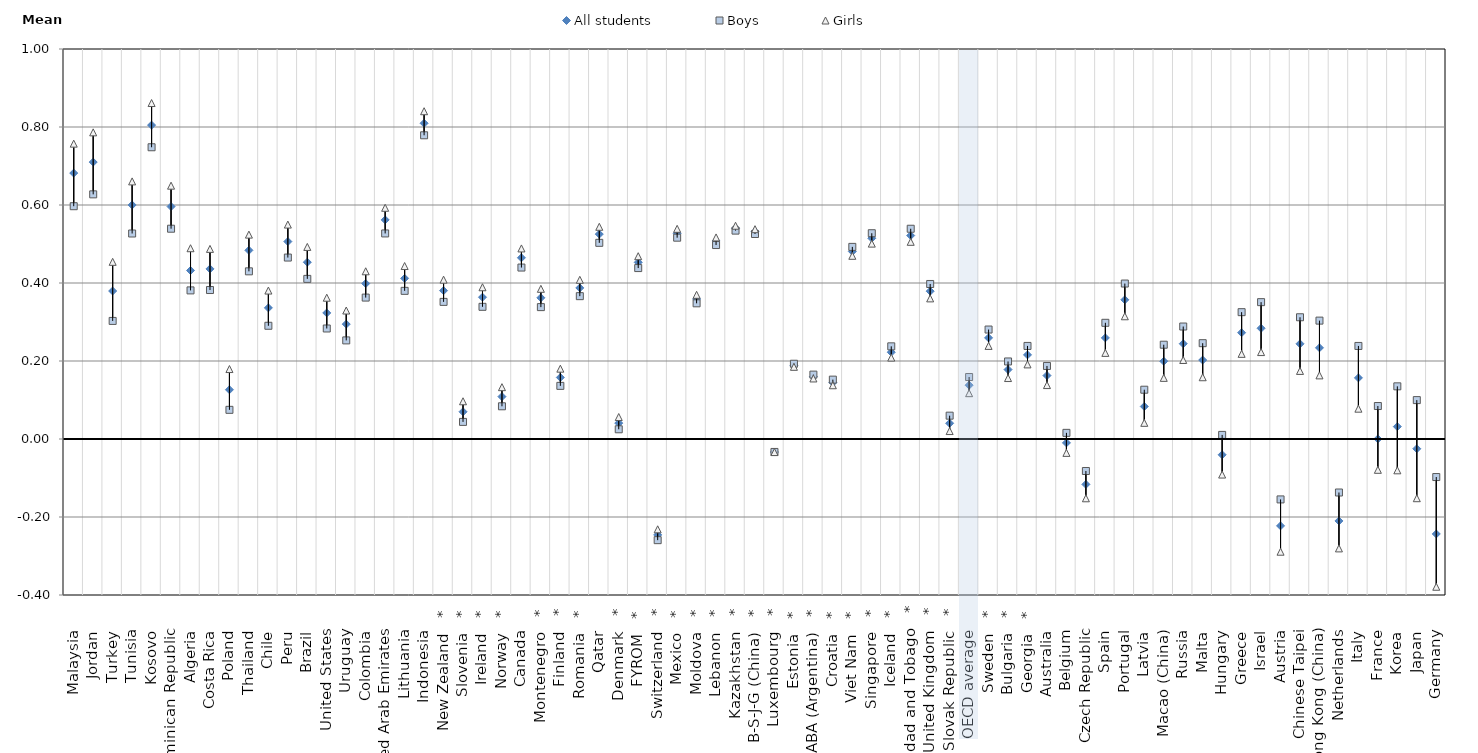
| Category | All students | Boys | Girls |
|---|---|---|---|
| Malaysia     | 0.682 | 0.597 | 0.757 |
| Jordan     | 0.71 | 0.627 | 0.786 |
| Turkey     | 0.379 | 0.303 | 0.454 |
| Tunisia     | 0.6 | 0.527 | 0.661 |
| Kosovo     | 0.805 | 0.748 | 0.861 |
| Dominican Republic     | 0.596 | 0.539 | 0.65 |
| Algeria     | 0.432 | 0.381 | 0.489 |
| Costa Rica     | 0.436 | 0.382 | 0.487 |
| Poland     | 0.126 | 0.075 | 0.179 |
| Thailand     | 0.484 | 0.43 | 0.524 |
| Chile     | 0.336 | 0.29 | 0.381 |
| Peru     | 0.506 | 0.465 | 0.55 |
| Brazil     | 0.453 | 0.411 | 0.492 |
| United States     | 0.323 | 0.283 | 0.362 |
| Uruguay     | 0.295 | 0.253 | 0.329 |
| Colombia     | 0.399 | 0.363 | 0.43 |
| United Arab Emirates     | 0.562 | 0.527 | 0.593 |
| Lithuania     | 0.412 | 0.38 | 0.444 |
| Indonesia     | 0.81 | 0.779 | 0.84 |
| New Zealand   * | 0.38 | 0.352 | 0.409 |
| Slovenia   * | 0.07 | 0.044 | 0.097 |
| Ireland   * | 0.364 | 0.339 | 0.389 |
| Norway   * | 0.109 | 0.084 | 0.133 |
| Canada     | 0.465 | 0.44 | 0.489 |
| Montenegro   * | 0.362 | 0.338 | 0.385 |
| Finland   * | 0.158 | 0.136 | 0.18 |
| Romania   * | 0.387 | 0.366 | 0.408 |
| Qatar     | 0.525 | 0.503 | 0.544 |
| Denmark   * | 0.041 | 0.025 | 0.056 |
| FYROM   * | 0.453 | 0.438 | 0.469 |
| Switzerland   * | -0.246 | -0.259 | -0.232 |
| Mexico   * | 0.527 | 0.516 | 0.539 |
| Moldova   * | 0.359 | 0.348 | 0.37 |
| Lebanon   * | 0.508 | 0.497 | 0.517 |
| Kazakhstan   * | 0.54 | 0.534 | 0.547 |
| B-S-J-G (China)   * | 0.531 | 0.526 | 0.538 |
| Luxembourg   * | -0.033 | -0.033 | -0.034 |
| Estonia   * | 0.189 | 0.193 | 0.185 |
| CABA (Argentina)   * | 0.16 | 0.165 | 0.155 |
| Croatia   * | 0.145 | 0.152 | 0.138 |
| Viet Nam   * | 0.481 | 0.493 | 0.47 |
| Singapore   * | 0.515 | 0.528 | 0.501 |
| Iceland   * | 0.223 | 0.238 | 0.209 |
| Trinidad and Tobago   * | 0.522 | 0.539 | 0.506 |
| United Kingdom   * | 0.379 | 0.398 | 0.361 |
| Slovak Republic   * | 0.04 | 0.06 | 0.02 |
| OECD average     | 0.138 | 0.159 | 0.117 |
| Sweden   * | 0.259 | 0.281 | 0.239 |
| Bulgaria   * | 0.178 | 0.199 | 0.156 |
| Georgia   * | 0.216 | 0.239 | 0.191 |
| Australia     | 0.163 | 0.187 | 0.138 |
| Belgium     | -0.01 | 0.016 | -0.036 |
| Czech Republic     | -0.116 | -0.082 | -0.152 |
| Spain     | 0.259 | 0.298 | 0.221 |
| Portugal     | 0.357 | 0.399 | 0.315 |
| Latvia     | 0.083 | 0.126 | 0.041 |
| Macao (China)     | 0.199 | 0.242 | 0.157 |
| Russia     | 0.244 | 0.288 | 0.203 |
| Malta     | 0.202 | 0.246 | 0.158 |
| Hungary     | -0.04 | 0.011 | -0.091 |
| Greece     | 0.273 | 0.325 | 0.218 |
| Israel     | 0.284 | 0.351 | 0.223 |
| Austria     | -0.223 | -0.155 | -0.289 |
| Chinese Taipei     | 0.244 | 0.312 | 0.175 |
| Hong Kong (China)     | 0.234 | 0.304 | 0.163 |
| Netherlands     | -0.21 | -0.137 | -0.281 |
| Italy     | 0.157 | 0.239 | 0.078 |
| France     | 0 | 0.085 | -0.079 |
| Korea     | 0.032 | 0.135 | -0.08 |
| Japan     | -0.025 | 0.1 | -0.152 |
| Germany     | -0.243 | -0.098 | -0.379 |